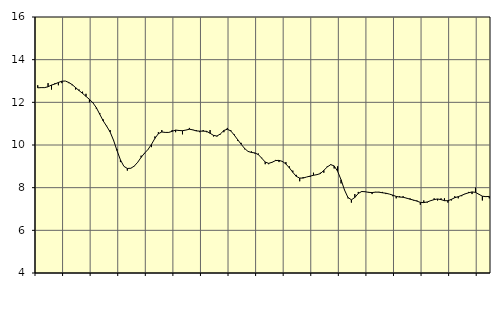
| Category | Piggar | Tillverkning av verkstadsvaror, SNI 25-30, 33 |
|---|---|---|
| nan | 12.8 | 12.68 |
| 87.0 | 12.7 | 12.69 |
| 87.0 | 12.7 | 12.69 |
| 87.0 | 12.9 | 12.73 |
| nan | 12.6 | 12.81 |
| 88.0 | 12.9 | 12.86 |
| 88.0 | 12.8 | 12.93 |
| 88.0 | 12.9 | 12.99 |
| nan | 13 | 13 |
| 89.0 | 12.9 | 12.93 |
| 89.0 | 12.8 | 12.83 |
| 89.0 | 12.6 | 12.69 |
| nan | 12.6 | 12.55 |
| 90.0 | 12.5 | 12.42 |
| 90.0 | 12.4 | 12.28 |
| 90.0 | 12 | 12.14 |
| nan | 12 | 11.98 |
| 91.0 | 11.7 | 11.75 |
| 91.0 | 11.5 | 11.44 |
| 91.0 | 11.2 | 11.13 |
| nan | 10.9 | 10.88 |
| 92.0 | 10.7 | 10.61 |
| 92.0 | 10.2 | 10.22 |
| 92.0 | 9.8 | 9.74 |
| nan | 9.2 | 9.3 |
| 93.0 | 9 | 9 |
| 93.0 | 8.8 | 8.9 |
| 93.0 | 8.9 | 8.91 |
| nan | 9 | 9.01 |
| 94.0 | 9.2 | 9.19 |
| 94.0 | 9.5 | 9.42 |
| 94.0 | 9.6 | 9.62 |
| nan | 9.8 | 9.79 |
| 95.0 | 9.9 | 10.03 |
| 95.0 | 10.4 | 10.31 |
| 95.0 | 10.6 | 10.53 |
| nan | 10.7 | 10.61 |
| 96.0 | 10.6 | 10.59 |
| 96.0 | 10.6 | 10.59 |
| 96.0 | 10.7 | 10.64 |
| nan | 10.6 | 10.7 |
| 97.0 | 10.7 | 10.68 |
| 97.0 | 10.5 | 10.67 |
| 97.0 | 10.7 | 10.7 |
| nan | 10.8 | 10.74 |
| 98.0 | 10.7 | 10.71 |
| 98.0 | 10.7 | 10.66 |
| 98.0 | 10.6 | 10.65 |
| nan | 10.7 | 10.65 |
| 99.0 | 10.6 | 10.64 |
| 99.0 | 10.7 | 10.55 |
| 99.0 | 10.4 | 10.45 |
| nan | 10.4 | 10.42 |
| 0.0 | 10.5 | 10.52 |
| 0.0 | 10.6 | 10.68 |
| 0.0 | 10.8 | 10.74 |
| nan | 10.7 | 10.66 |
| 1.0 | 10.5 | 10.47 |
| 1.0 | 10.2 | 10.25 |
| 1.0 | 10.1 | 10.04 |
| nan | 9.8 | 9.84 |
| 2.0 | 9.7 | 9.7 |
| 2.0 | 9.7 | 9.65 |
| 2.0 | 9.6 | 9.63 |
| nan | 9.6 | 9.55 |
| 3.0 | 9.4 | 9.38 |
| 3.0 | 9.1 | 9.2 |
| 3.0 | 9.1 | 9.14 |
| nan | 9.2 | 9.19 |
| 4.0 | 9.3 | 9.27 |
| 4.0 | 9.2 | 9.28 |
| 4.0 | 9.2 | 9.23 |
| nan | 9.2 | 9.11 |
| 5.0 | 9 | 8.93 |
| 5.0 | 8.8 | 8.72 |
| 5.0 | 8.6 | 8.53 |
| nan | 8.3 | 8.45 |
| 6.0 | 8.5 | 8.45 |
| 6.0 | 8.5 | 8.5 |
| 6.0 | 8.5 | 8.54 |
| nan | 8.7 | 8.58 |
| 7.0 | 8.6 | 8.61 |
| 7.0 | 8.7 | 8.66 |
| 7.0 | 8.7 | 8.81 |
| nan | 9 | 8.97 |
| 8.0 | 9.1 | 9.08 |
| 8.0 | 8.9 | 9.02 |
| 8.0 | 9 | 8.77 |
| nan | 8.2 | 8.37 |
| 9.0 | 7.9 | 7.89 |
| 9.0 | 7.5 | 7.54 |
| 9.0 | 7.3 | 7.43 |
| nan | 7.7 | 7.54 |
| 10.0 | 7.8 | 7.73 |
| 10.0 | 7.8 | 7.82 |
| 10.0 | 7.8 | 7.81 |
| nan | 7.8 | 7.78 |
| 11.0 | 7.7 | 7.77 |
| 11.0 | 7.8 | 7.79 |
| 11.0 | 7.8 | 7.79 |
| nan | 7.8 | 7.76 |
| 12.0 | 7.7 | 7.74 |
| 12.0 | 7.7 | 7.7 |
| 12.0 | 7.6 | 7.65 |
| nan | 7.5 | 7.59 |
| 13.0 | 7.6 | 7.56 |
| 13.0 | 7.6 | 7.55 |
| 13.0 | 7.5 | 7.51 |
| nan | 7.5 | 7.46 |
| 14.0 | 7.4 | 7.42 |
| 14.0 | 7.4 | 7.37 |
| 14.0 | 7.2 | 7.31 |
| nan | 7.4 | 7.3 |
| 15.0 | 7.3 | 7.33 |
| 15.0 | 7.4 | 7.39 |
| 15.0 | 7.5 | 7.44 |
| nan | 7.4 | 7.47 |
| 16.0 | 7.5 | 7.44 |
| 16.0 | 7.5 | 7.39 |
| 16.0 | 7.3 | 7.39 |
| nan | 7.4 | 7.45 |
| 17.0 | 7.6 | 7.53 |
| 17.0 | 7.5 | 7.58 |
| 17.0 | 7.6 | 7.64 |
| nan | 7.7 | 7.71 |
| 18.0 | 7.8 | 7.76 |
| 18.0 | 7.7 | 7.8 |
| 18.0 | 8 | 7.78 |
| nan | 7.7 | 7.69 |
| 19.0 | 7.4 | 7.6 |
| 19.0 | 7.6 | 7.58 |
| 19.0 | 7.5 | 7.59 |